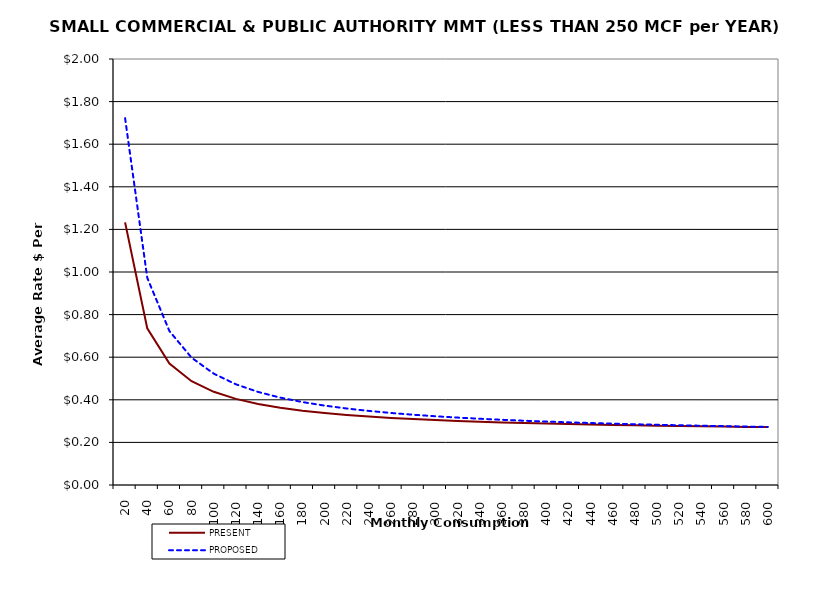
| Category | PRESENT | PROPOSED |
|---|---|---|
| 20.0 | 1.233 | 1.723 |
| 40.0 | 0.736 | 0.973 |
| 60.0 | 0.57 | 0.723 |
| 80.0 | 0.487 | 0.598 |
| 100.0 | 0.438 | 0.523 |
| 120.0 | 0.404 | 0.473 |
| 140.0 | 0.381 | 0.437 |
| 160.0 | 0.363 | 0.41 |
| 180.0 | 0.349 | 0.389 |
| 200.0 | 0.338 | 0.373 |
| 220.0 | 0.329 | 0.359 |
| 240.0 | 0.321 | 0.348 |
| 260.0 | 0.315 | 0.338 |
| 280.0 | 0.31 | 0.33 |
| 300.0 | 0.305 | 0.323 |
| 320.0 | 0.301 | 0.316 |
| 340.0 | 0.297 | 0.311 |
| 360.0 | 0.294 | 0.306 |
| 380.0 | 0.291 | 0.302 |
| 400.0 | 0.288 | 0.298 |
| 420.0 | 0.286 | 0.294 |
| 440.0 | 0.284 | 0.291 |
| 460.0 | 0.282 | 0.288 |
| 480.0 | 0.28 | 0.285 |
| 500.0 | 0.278 | 0.283 |
| 520.0 | 0.277 | 0.28 |
| 540.0 | 0.275 | 0.278 |
| 560.0 | 0.274 | 0.276 |
| 580.0 | 0.273 | 0.274 |
| 600.0 | 0.272 | 0.273 |